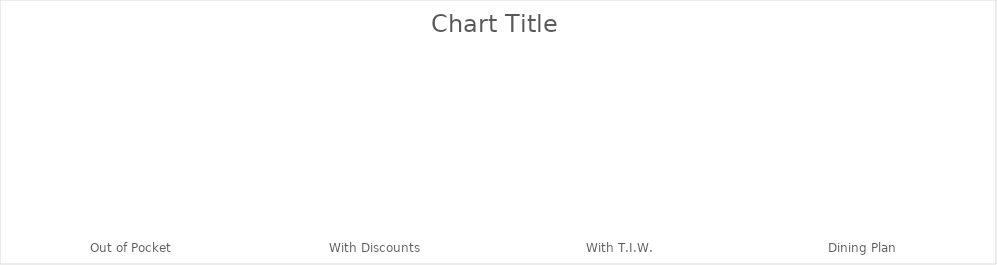
| Category | Series 0 |
|---|---|
| Out of Pocket | 0 |
| With Discounts | 0 |
| With T.I.W. | 0 |
| Dining Plan | 0 |